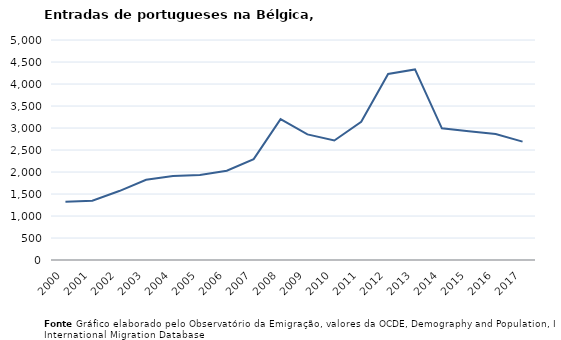
| Category | Entradas |
|---|---|
| 2000.0 | 1324 |
| 2001.0 | 1347 |
| 2002.0 | 1567 |
| 2003.0 | 1823 |
| 2004.0 | 1907 |
| 2005.0 | 1934 |
| 2006.0 | 2030 |
| 2007.0 | 2293 |
| 2008.0 | 3200 |
| 2009.0 | 2854 |
| 2010.0 | 2717 |
| 2011.0 | 3140 |
| 2012.0 | 4228 |
| 2013.0 | 4332 |
| 2014.0 | 2993 |
| 2015.0 | 2927 |
| 2016.0 | 2863 |
| 2017.0 | 2691 |